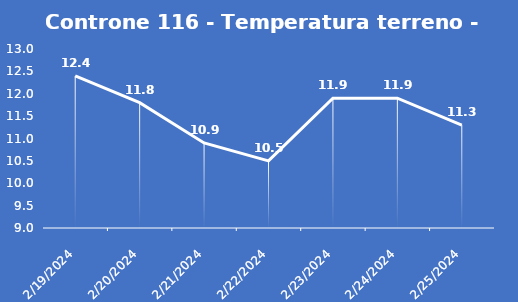
| Category | Controne 116 - Temperatura terreno - Grezzo (°C) |
|---|---|
| 2/19/24 | 12.4 |
| 2/20/24 | 11.8 |
| 2/21/24 | 10.9 |
| 2/22/24 | 10.5 |
| 2/23/24 | 11.9 |
| 2/24/24 | 11.9 |
| 2/25/24 | 11.3 |